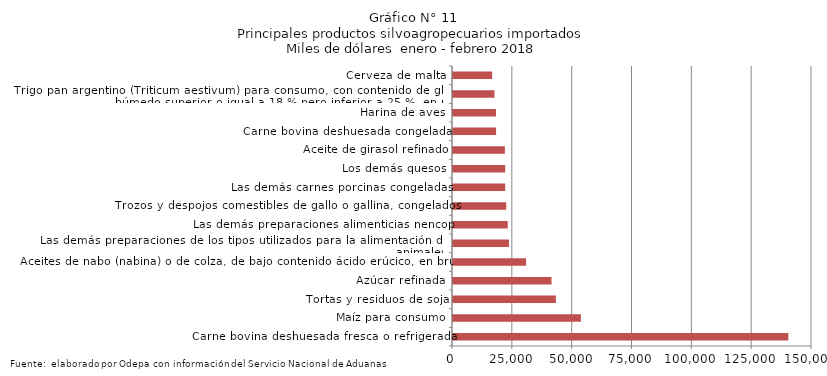
| Category | Series 0 |
|---|---|
| Carne bovina deshuesada fresca o refrigerada | 140102.832 |
| Maíz para consumo | 53449.269 |
| Tortas y residuos de soja | 42996.798 |
| Azúcar refinada | 41164.804 |
| Aceites de nabo (nabina) o de colza, de bajo contenido ácido erúcico, en bruto | 30536.28 |
| Las demás preparaciones de los tipos utilizados para la alimentación de los animales | 23378.436 |
| Las demás preparaciones alimenticias nencop | 22852.773 |
| Trozos y despojos comestibles de gallo o gallina, congelados | 22257.663 |
| Las demás carnes porcinas congeladas | 21806.828 |
| Los demás quesos | 21803.359 |
| Aceite de girasol refinado | 21677.777 |
| Carne bovina deshuesada congelada | 18007.24 |
| Harina de aves | 17957.877 |
| Trigo pan argentino (Triticum aestivum) para consumo, con contenido de gluten húmedo superior o igual a 18 % pero inferior a 25 %, en peso | 17330.383 |
| Cerveza de malta | 16359.204 |